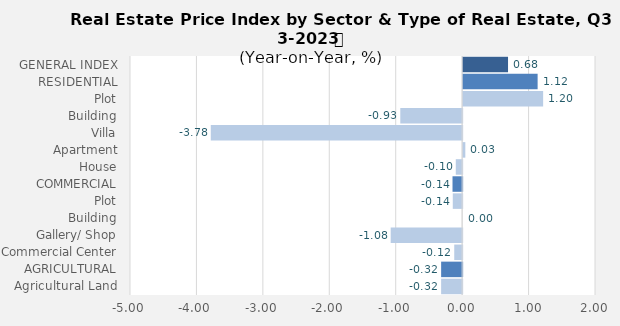
| Category | Q3- 2022 |
|---|---|
| GENERAL INDEX | 0.676 |
| RESIDENTIAL | 1.121 |
| Plot | 1.204 |
| Building | -0.931 |
| Villa | -3.784 |
| Apartment | 0.033 |
| House | -0.096 |
| COMMERCIAL | -0.145 |
| Plot | -0.141 |
| Building | 0 |
| Gallery/ Shop | -1.075 |
| Commercial Center | -0.119 |
| AGRICULTURAL | -0.316 |
| Agricultural Land | -0.316 |